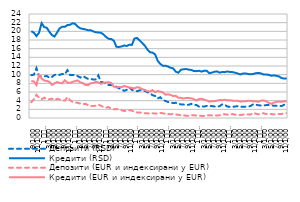
| Category | Депозити (RSD) | Кредити (RSD) | Депозити (EUR и индексирани у EUR) | Кредити (EUR и индексирани у EUR) |
|---|---|---|---|---|
| 9 | 9.89 | 20.01 | 3.65 | 8.55 |
| 10 | 9.99 | 19.69 | 4.32 | 8.42 |
| 11 | 11.52 | 18.9 | 5.34 | 7.6 |
| 12 | 9.67 | 19.67 | 4.74 | 9.96 |
| 1 
2012. | 9.59 | 21.9 | 4.32 | 9.12 |
| 2 | 9.59 | 20.99 | 4.69 | 8.65 |
| 3 | 9.71 | 20.82 | 4.32 | 8.55 |
| 4 | 9.27 | 19.89 | 4.3 | 8.36 |
| 5 | 9.48 | 19.14 | 4.47 | 7.65 |
| 6 | 9.94 | 18.8 | 4.11 | 7.99 |
| 7 | 10.06 | 19.73 | 4.42 | 8.3 |
| 8 | 9.95 | 20.71 | 4.28 | 8.11 |
| 9 | 10.18 | 21.05 | 4.09 | 8 |
| 10 | 10.04 | 21.04 | 4.03 | 8.7 |
| 11 | 11.04 | 21.44 | 4.81 | 8.19 |
| 12 | 9.92 | 21.51 | 4.15 | 8.08 |
| 1 
2013. | 9.94 | 21.85 | 3.69 | 8.33 |
| 2 | 9.96 | 21.73 | 3.58 | 8.53 |
| 3 | 9.66 | 21.08 | 3.51 | 8.67 |
| 4 | 9.32 | 20.7 | 3.31 | 8.23 |
| 5 | 9.67 | 20.55 | 3.19 | 8.05 |
| 6 | 9.33 | 20.44 | 3.27 | 7.62 |
| 7 | 9.01 | 20.26 | 2.96 | 7.58 |
| 8 | 9.03 | 20.28 | 2.79 | 8.03 |
| 9 | 8.88 | 19.98 | 2.77 | 8.06 |
| 10 | 8.9 | 19.79 | 2.84 | 8.35 |
| 11 | 9.83 | 19.73 | 3.11 | 8.21 |
| 12 | 8.33 | 19.67 | 2.82 | 7.88 |
| 1 
2014. | 8.19 | 19.27 | 2.52 | 8.09 |
| 2 | 7.86 | 18.69 | 2.38 | 8.21 |
| 3 | 7.59 | 18.27 | 2.54 | 8.26 |
| 4 | 7.59 | 18.21 | 2.05 | 8.1 |
| 5 | 7.51 | 17.83 | 2 | 7.24 |
| 6 | 7.2 | 16.43 | 2.08 | 7.04 |
| 7 | 6.86 | 16.39 | 1.91 | 7.21 |
| 8 | 6.62 | 16.51 | 1.77 | 7.12 |
| 9 | 6.27 | 16.73 | 1.63 | 7.39 |
| 10 | 6.5 | 16.62 | 1.59 | 7.23 |
| 11 | 7.06 | 16.9 | 1.8 | 7.03 |
| 12 | 6.51 | 16.87 | 1.71 | 6.93 |
| 1 
2015. | 6.24 | 18.34 | 1.38 | 6.83 |
| 2 | 6.18 | 18.47 | 1.29 | 7.11 |
| 3 | 6.39 | 17.89 | 1.29 | 7.02 |
| 4 | 6.34 | 17.3 | 1.15 | 6.65 |
| 5 | 6.24 | 16.68 | 1.09 | 6.48 |
| 6 | 5.95 | 15.8 | 1.08 | 6.2 |
| 7 | 5.68 | 15.18 | 1.01 | 6.11 |
| 8 | 5.27 | 15.09 | 1.08 | 6.44 |
| 9 | 5.08 | 14.68 | 1.03 | 5.96 |
| 10 | 4.49 | 13.2 | 0.99 | 6.22 |
| 11 | 4.8 | 12.48 | 1.19 | 6.08 |
| 12 | 4.17 | 12.05 | 1.08 | 5.92 |
| 1 
2016. | 3.93 | 12.07 | 0.97 | 5.36 |
| 2 | 3.69 | 11.87 | 0.94 | 5.47 |
| 3 | 3.58 | 11.6 | 0.85 | 5.33 |
| 4 | 3.43 | 11.44 | 0.95 | 5.09 |
| 5 | 3.51 | 10.69 | 0.8 | 5.11 |
| 6 | 3.29 | 10.45 | 0.75 | 4.66 |
| 7 | 3.15 | 11.13 | 0.63 | 4.66 |
| 8 | 3.11 | 11.25 | 0.61 | 4.49 |
| 9 | 3.05 | 11.3 | 0.54 | 4.62 |
| 10 | 3.04 | 11.17 | 0.51 | 4.59 |
| 11 | 3.28 | 11.09 | 0.68 | 4.54 |
| 12 | 3.01 | 10.84 | 0.63 | 4.36 |
| 1 
2017. | 3.01 | 10.81 | 0.57 | 4.04 |
| 2 | 2.63 | 10.9 | 0.52 | 4.37 |
| 3 | 2.7 | 10.7 | 0.49 | 4.46 |
| 4 | 2.63 | 10.91 | 0.46 | 4.24 |
| 5 | 2.79 | 10.88 | 0.58 | 4.05 |
| 6 | 2.73 | 10.35 | 0.66 | 3.78 |
| 7 | 2.76 | 10.47 | 0.59 | 3.86 |
| 8 | 2.64 | 10.67 | 0.6 | 3.87 |
| 9 | 2.61 | 10.75 | 0.59 | 4 |
| 10 | 2.72 | 10.47 | 0.62 | 4.14 |
| 11 | 3.15 | 10.61 | 0.84 | 4.11 |
| 12 | 3.03 | 10.58 | 0.88 | 4.21 |
| 1 
2018. | 2.65 | 10.74 | 0.76 | 4.06 |
| 2 | 2.56 | 10.62 | 0.81 | 4.08 |
| 3 | 2.57 | 10.59 | 0.91 | 4.01 |
| 4 | 2.65 | 10.44 | 0.76 | 3.98 |
| 5 | 2.74 | 10.28 | 0.77 | 3.99 |
| 6 | 2.62 | 10.06 | 0.68 | 3.76 |
| 7 | 2.57 | 10.26 | 0.78 | 3.87 |
| 8 | 2.61 | 10.28 | 0.79 | 3.84 |
| 9 | 2.61 | 10.17 | 0.84 | 3.97 |
| 10 | 2.78 | 10.09 | 0.81 | 3.98 |
| 11 | 3.16 | 10.17 | 1.16 | 3.84 |
| 12 | 3.07 | 10.34 | 1 | 3.87 |
| 1 
2019. | 2.94 | 10.39 | 0.85 | 3.73 |
| 2 | 2.89 | 10.3 | 0.97 | 4 |
| 3 | 2.87 | 10.04 | 1.1 | 4.06 |
| 4 | 2.97 | 10.03 | 0.92 | 3.88 |
| 5 | 2.99 | 9.98 | 0.97 | 3.49 |
| 6 | 2.99 | 9.75 | 0.91 | 3.28 |
| 7 | 2.8 | 9.82 | 0.83 | 3.54 |
| 8 | 2.83 | 9.74 | 0.86 | 3.72 |
| 9 | 2.82 | 9.59 | 0.9 | 3.79 |
| 10 | 2.74 | 9.22 | 0.94 | 3.75 |
| 11 | 3.07 | 9.11 | 1.12 | 3.84 |
| 12 | 3.01 | 9.11 | 1.13 | 3.84 |